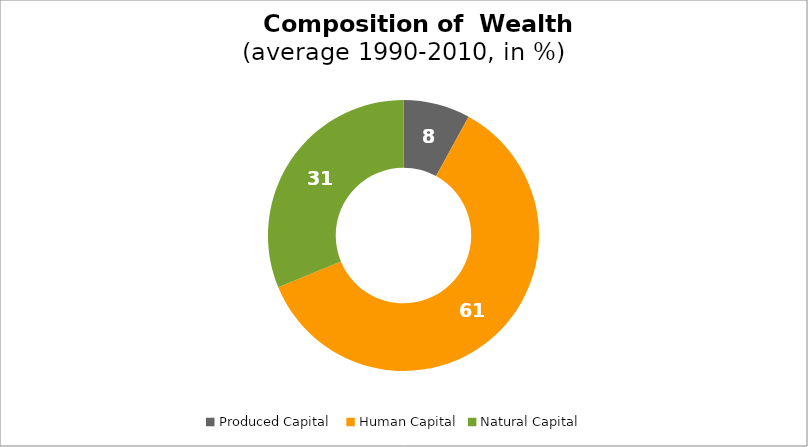
| Category | Series 0 |
|---|---|
| Produced Capital  | 7.982 |
| Human Capital | 60.776 |
| Natural Capital | 31.243 |